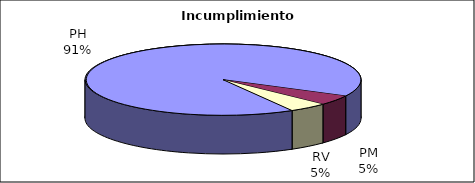
| Category | Efectivo |
|---|---|
| PH | 20 |
| PM | 1 |
| RV | 1 |